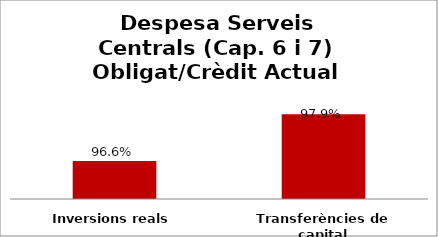
| Category | Series 0 |
|---|---|
| Inversions reals | 0.966 |
| Transferències de capital | 0.979 |